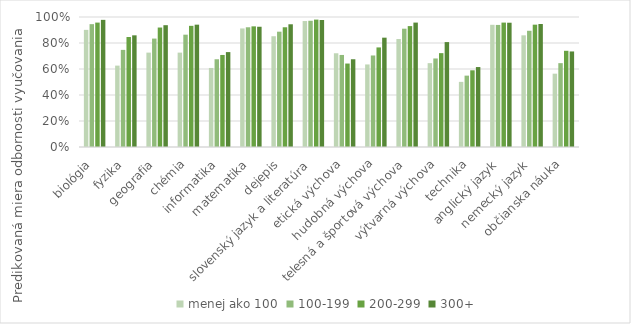
| Category | menej ako 100 | 100-199 | 200-299 | 300+ |
|---|---|---|---|---|
| biológia | 0.901 | 0.945 | 0.957 | 0.978 |
| fyzika | 0.626 | 0.747 | 0.846 | 0.859 |
| geografia | 0.726 | 0.834 | 0.919 | 0.937 |
| chémia | 0.726 | 0.864 | 0.932 | 0.941 |
| informatika | 0.608 | 0.675 | 0.708 | 0.73 |
| matematika | 0.912 | 0.921 | 0.928 | 0.925 |
| dejepis | 0.852 | 0.887 | 0.921 | 0.944 |
| slovenský jazyk a literatúra | 0.969 | 0.971 | 0.98 | 0.977 |
| etická výchova | 0.721 | 0.708 | 0.642 | 0.675 |
| hudobná výchova | 0.635 | 0.704 | 0.766 | 0.841 |
| telesná a športová výchova | 0.831 | 0.91 | 0.93 | 0.957 |
| výtvarná výchova | 0.645 | 0.681 | 0.722 | 0.807 |
| technika | 0.501 | 0.549 | 0.59 | 0.615 |
| anglický jazyk | 0.94 | 0.939 | 0.957 | 0.956 |
| nemecký jazyk | 0.859 | 0.894 | 0.941 | 0.946 |
| občianska náuka | 0.564 | 0.645 | 0.74 | 0.735 |